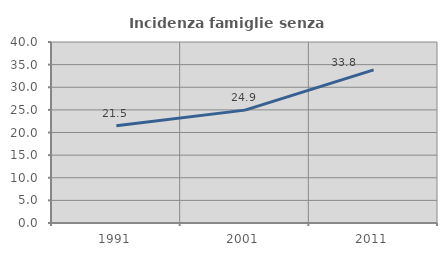
| Category | Incidenza famiglie senza nuclei |
|---|---|
| 1991.0 | 21.511 |
| 2001.0 | 24.947 |
| 2011.0 | 33.826 |